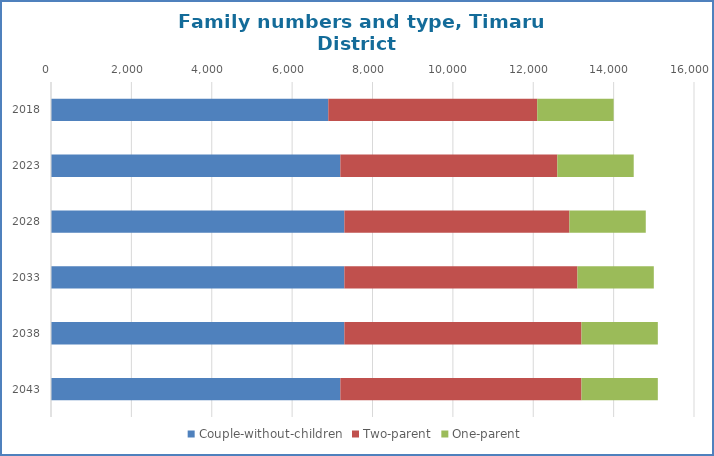
| Category | Couple-without-children | Two-parent | One-parent |
|---|---|---|---|
| 2018.0 | 6900 | 5200 | 1900 |
| 2023.0 | 7200 | 5400 | 1900 |
| 2028.0 | 7300 | 5600 | 1900 |
| 2033.0 | 7300 | 5800 | 1900 |
| 2038.0 | 7300 | 5900 | 1900 |
| 2043.0 | 7200 | 6000 | 1900 |